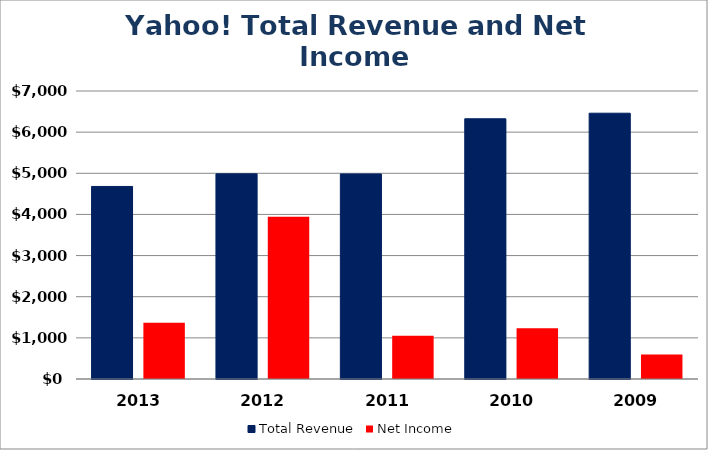
| Category | Total Revenue | Net Income |
|---|---|---|
| 2013.0 | 4680 | 1366 |
| 2012.0 | 4987 | 3945 |
| 2011.0 | 4984 | 1049 |
| 2010.0 | 6325 | 1232 |
| 2009.0 | 6460 | 598 |